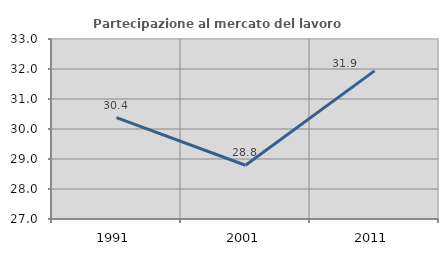
| Category | Partecipazione al mercato del lavoro  femminile |
|---|---|
| 1991.0 | 30.382 |
| 2001.0 | 28.792 |
| 2011.0 | 31.937 |